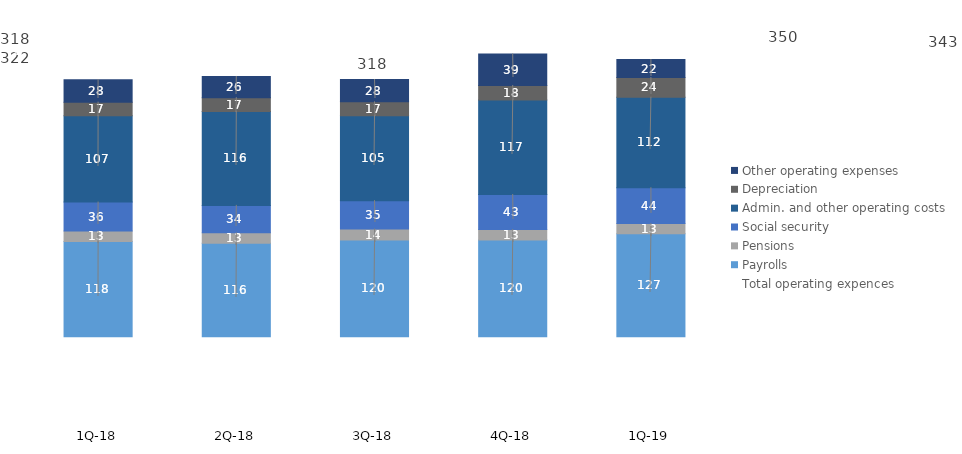
| Category | Payrolls | Pensions | Social security | Admin. and other operating costs | Depreciation | Other operating expenses |
|---|---|---|---|---|---|---|
| 1Q-19 | 127.289 | 12.805 | 44.276 | 112.059 | 24.33 | 22.21 |
| 4Q-18 | 119.563 | 13.071 | 43.33 | 117.052 | 17.876 | 38.942 |
| 3Q-18 | 119.65 | 13.542 | 35.208 | 105.09 | 17.18 | 27.579 |
| 2Q-18 | 115.69 | 12.848 | 33.982 | 116.179 | 17.17 | 26.198 |
| 1Q-18 | 117.7 | 13 | 35.9 | 107 | 16.7 | 27.8 |